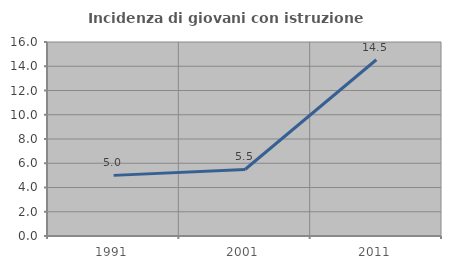
| Category | Incidenza di giovani con istruzione universitaria |
|---|---|
| 1991.0 | 5 |
| 2001.0 | 5.485 |
| 2011.0 | 14.535 |